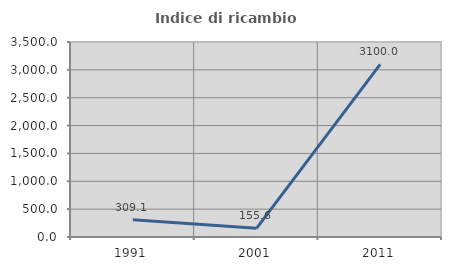
| Category | Indice di ricambio occupazionale  |
|---|---|
| 1991.0 | 309.091 |
| 2001.0 | 155.556 |
| 2011.0 | 3100 |